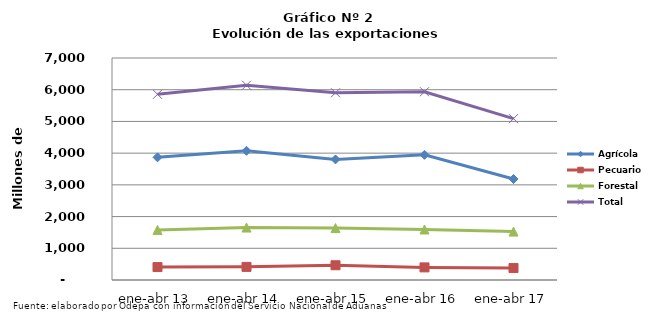
| Category | Agrícola | Pecuario | Forestal | Total |
|---|---|---|---|---|
| ene-abr 13 | 3868160 | 407919 | 1579260 | 5855339 |
| ene-abr 14 | 4074303 | 414037 | 1653823 | 6142163 |
| ene-abr 15 | 3801593 | 465060 | 1637267 | 5903920 |
| ene-abr 16 | 3946419 | 397598 | 1592062 | 5936079 |
| ene-abr 17 | 3184483 | 376889 | 1526552 | 5087924 |